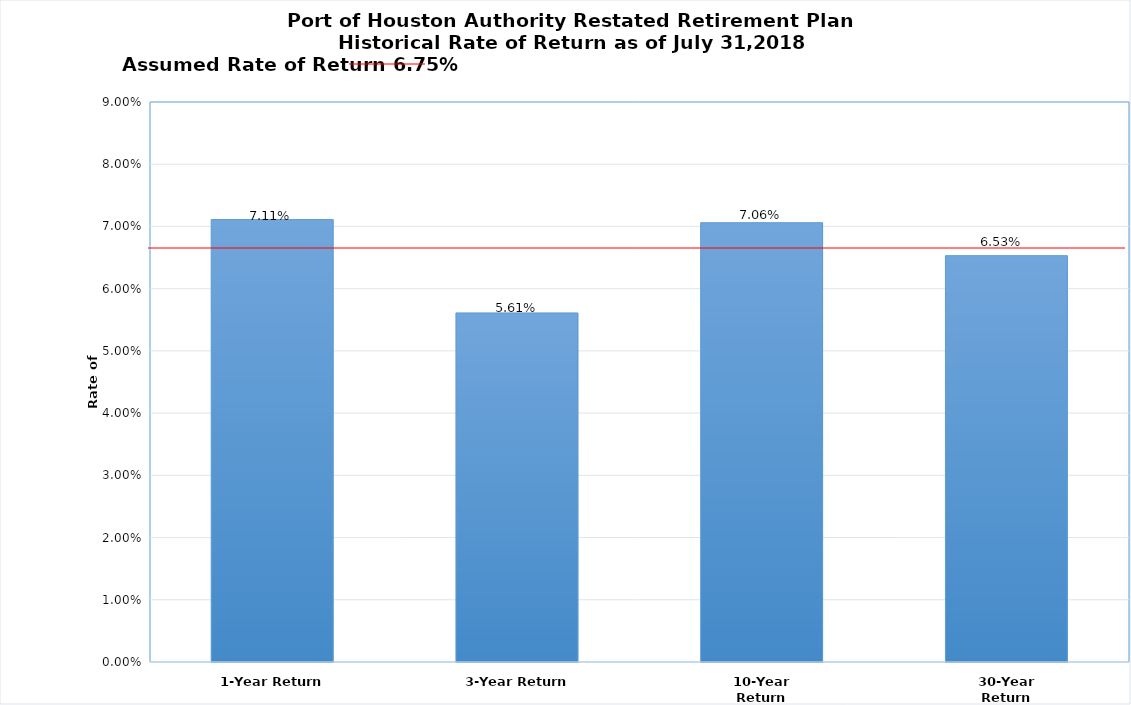
| Category | Series 0 |
|---|---|
| 1-Year Return | 0.071 |
| 3-Year Return | 0.056 |
| 10-Year Return | 0.071 |
| 30-Year Return | 0.065 |